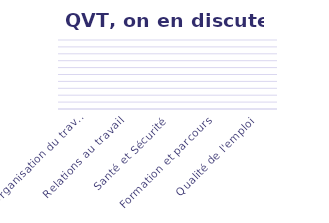
| Category | On en discute |
|---|---|
| Organisation du travail | 0 |
| Relations au travail | 0 |
| Santé et Sécurité | 0 |
| Formation et parcours | 0 |
| Qualité de l'emploi | 0 |